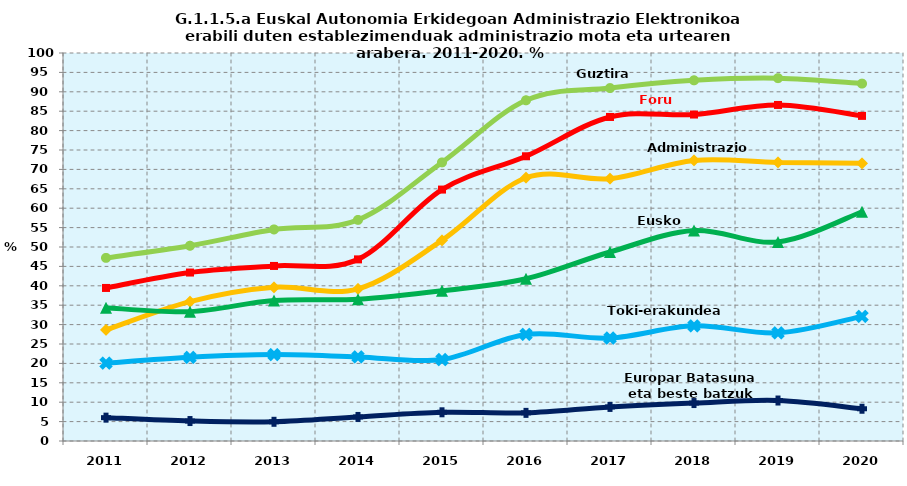
| Category | Guztira | Foru aldundiak | Administrazio Zentrala | Eusko Jaurlaritza | Toki-erakundeak | Europar Batasuna eta beste batzuk |
|---|---|---|---|---|---|---|
| 2011.0 | 47.195 | 39.446 | 28.619 | 34.347 | 20.063 | 6.017 |
| 2012.0 | 50.321 | 43.417 | 35.926 | 33.339 | 21.568 | 5.144 |
| 2013.0 | 54.524 | 45.118 | 39.622 | 36.207 | 22.264 | 4.948 |
| 2014.0 | 56.986 | 46.807 | 39.221 | 36.539 | 21.658 | 6.198 |
| 2015.0 | 71.8 | 64.8 | 51.7 | 38.7 | 21 | 7.4 |
| 2016.0 | 87.813 | 73.385 | 67.853 | 41.82 | 27.461 | 7.249 |
| 2017.0 | 90.959 | 83.514 | 67.612 | 48.718 | 26.543 | 8.784 |
| 2018.0 | 92.961 | 84.142 | 72.311 | 54.229 | 29.694 | 9.782 |
| 2019.0 | 93.517 | 86.609 | 71.787 | 51.305 | 27.87 | 10.432 |
| 2020.0 | 92.114 | 83.794 | 71.565 | 59.083 | 32.123 | 8.311 |